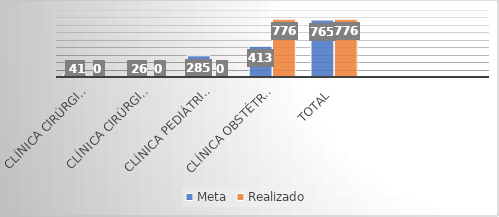
| Category | Meta | Realizado |
|---|---|---|
| Clínica Cirúrgica Pediátrica | 41 | 0 |
| Clínica Cirúrgica CERFIS | 26 | 0 |
| Clínica Pediátrica | 285 | 0 |
| Clínica Obstétrica | 413 | 776 |
| Total | 765 | 776 |